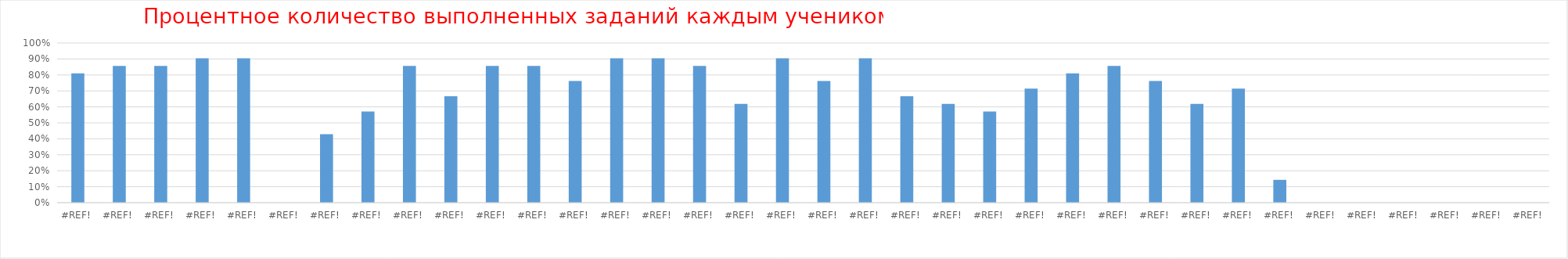
| Category | Series 0 |
|---|---|
| 0.0 | 0.81 |
| 0.0 | 0.857 |
| 0.0 | 0.857 |
| 0.0 | 0.905 |
| 0.0 | 0.905 |
| 0.0 | 0 |
| 0.0 | 0.429 |
| 0.0 | 0.571 |
| 0.0 | 0.857 |
| 0.0 | 0.667 |
| 0.0 | 0.857 |
| 0.0 | 0.857 |
| 0.0 | 0.762 |
| 0.0 | 0.905 |
| 0.0 | 0.905 |
| 0.0 | 0.857 |
| 0.0 | 0.619 |
| 0.0 | 0.905 |
| 0.0 | 0.762 |
| 0.0 | 0.905 |
| 0.0 | 0.667 |
| 0.0 | 0.619 |
| 0.0 | 0.571 |
| 0.0 | 0.714 |
| 0.0 | 0.81 |
| 0.0 | 0.857 |
| 0.0 | 0.762 |
| 0.0 | 0.619 |
| 0.0 | 0.714 |
| 0.0 | 0.143 |
| 0.0 | 0 |
| 0.0 | 0 |
| 0.0 | 0 |
| 0.0 | 0 |
| 0.0 | 0 |
| 0.0 | 0 |